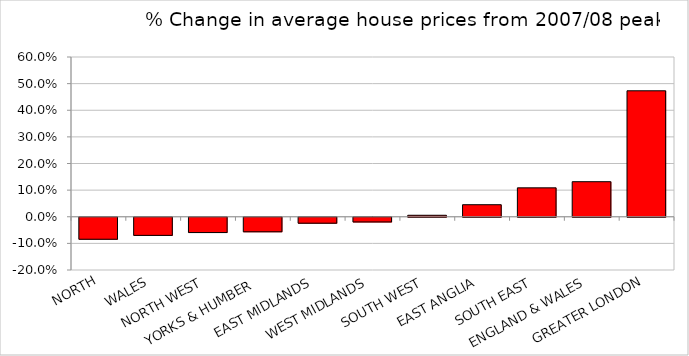
| Category | % Change |
|---|---|
| NORTH | -0.083 |
| WALES | -0.068 |
| NORTH WEST | -0.058 |
| YORKS & HUMBER  | -0.055 |
| EAST MIDLANDS | -0.022 |
| WEST MIDLANDS | -0.018 |
| SOUTH WEST | 0.006 |
| EAST ANGLIA | 0.045 |
| SOUTH EAST | 0.109 |
| ENGLAND & WALES | 0.132 |
| GREATER LONDON | 0.473 |